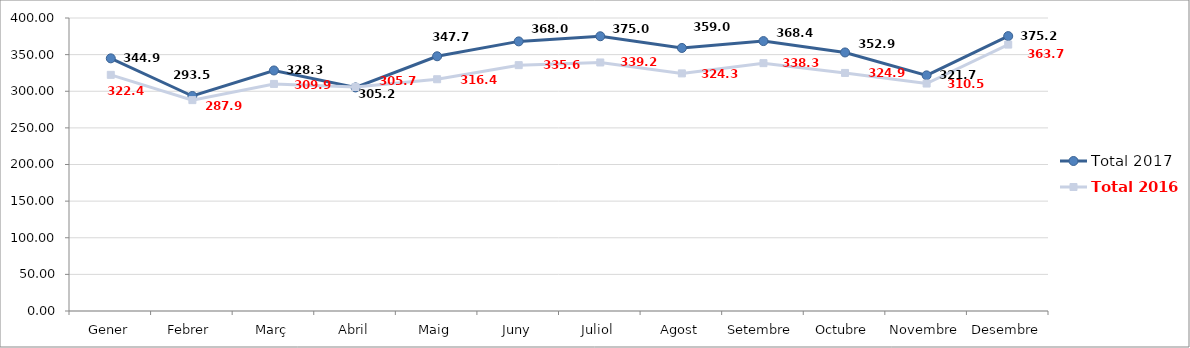
| Category | Total 2017 | Total 2016 |
|---|---|---|
| Gener | 344.921 | 322.4 |
| Febrer | 293.52 | 287.9 |
| Març | 328.375 | 309.99 |
| Abril | 305.203 | 305.784 |
| Maig | 347.762 | 316.4 |
| Juny | 368.079 | 335.63 |
| Juliol | 375.079 | 339.28 |
| Agost | 359.091 | 324.38 |
| Setembre | 368.495 | 338.359 |
| Octubre | 352.978 | 324.98 |
| Novembre | 321.7 | 310.529 |
| Desembre | 375.28 | 363.71 |